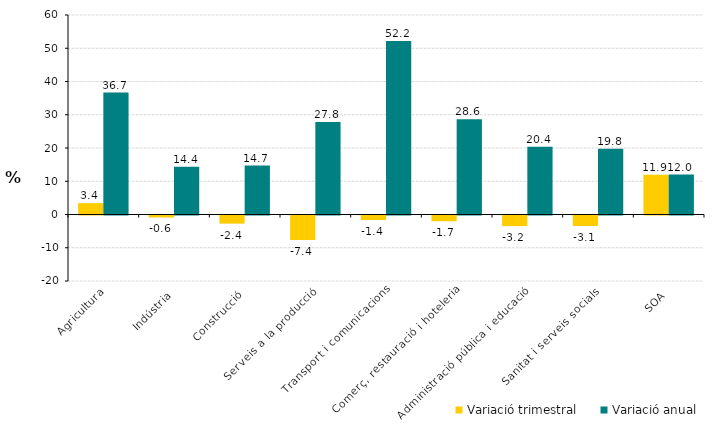
| Category | Variació trimestral | Variació anual |
|---|---|---|
| Agricultura | 3.422 | 36.683 |
| Indústria | -0.601 | 14.359 |
| Construcció | -2.441 | 14.737 |
| Serveis a la producció | -7.361 | 27.842 |
| Transport i comunicacions | -1.367 | 52.208 |
| Comerç, restauració i hoteleria | -1.728 | 28.624 |
| Administració pública i educació | -3.202 | 20.363 |
| Sanitat i serveis socials | -3.139 | 19.774 |
| SOA | 11.922 | 12.009 |